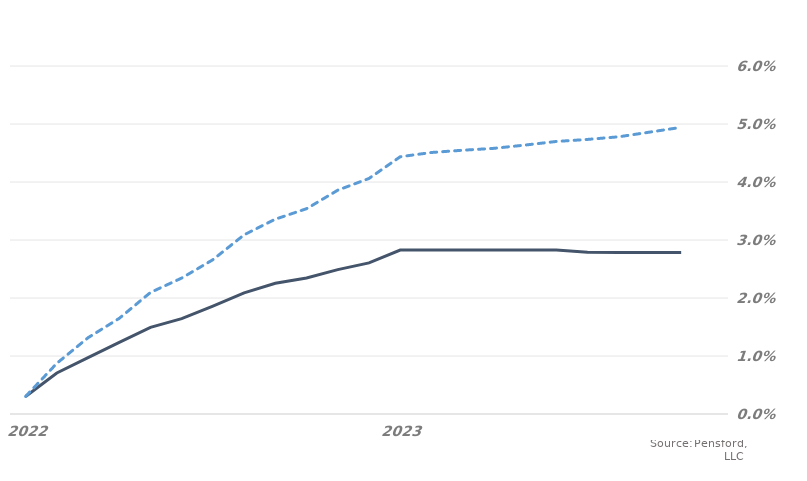
| Category | MARKET EXPECTATIONS | +1 Standard Deviation |
|---|---|---|
| 2022-03-31 | 0.003 | 0.003 |
| 2022-04-30 | 0.007 | 0.009 |
| 2022-05-30 | 0.01 | 0.013 |
| 2022-06-30 | 0.012 | 0.016 |
| 2022-07-30 | 0.015 | 0.021 |
| 2022-08-30 | 0.016 | 0.023 |
| 2022-09-30 | 0.019 | 0.027 |
| 2022-10-30 | 0.021 | 0.031 |
| 2022-11-30 | 0.023 | 0.034 |
| 2022-12-30 | 0.023 | 0.035 |
| 2023-01-30 | 0.025 | 0.039 |
| 2023-02-28 | 0.026 | 0.041 |
| 2023-03-28 | 0.028 | 0.044 |
| 2023-04-28 | 0.028 | 0.045 |
| 2023-05-28 | 0.028 | 0.045 |
| 2023-06-28 | 0.028 | 0.046 |
| 2023-07-28 | 0.028 | 0.046 |
| 2023-08-28 | 0.028 | 0.047 |
| 2023-09-28 | 0.028 | 0.047 |
| 2023-10-28 | 0.028 | 0.048 |
| 2023-11-28 | 0.028 | 0.049 |
| 2023-12-28 | 0.028 | 0.049 |
| 2024-01-28 | 0.028 | 0.05 |
| 2024-02-28 | 0.028 | 0.05 |
| 2024-03-28 | 0.025 | 0.047 |
| 2024-04-28 | 0.025 | 0.047 |
| 2024-05-28 | 0.025 | 0.047 |
| 2024-06-28 | 0.025 | 0.048 |
| 2024-07-28 | 0.025 | 0.048 |
| 2024-08-28 | 0.025 | 0.049 |
| 2024-09-28 | 0.025 | 0.049 |
| 2024-10-28 | 0.025 | 0.049 |
| 2024-11-28 | 0.025 | 0.05 |
| 2024-12-28 | 0.025 | 0.05 |
| 2025-01-28 | 0.025 | 0.05 |
| 2025-02-28 | 0.025 | 0.05 |
| 2025-03-28 | 0.022 | 0.046 |
| 2025-04-28 | 0.021 | 0.045 |
| 2025-05-28 | 0.021 | 0.045 |
| 2025-06-28 | 0.021 | 0.045 |
| 2025-07-28 | 0.021 | 0.046 |
| 2025-08-28 | 0.021 | 0.046 |
| 2025-09-28 | 0.021 | 0.047 |
| 2025-10-28 | 0.021 | 0.047 |
| 2025-11-28 | 0.021 | 0.047 |
| 2025-12-28 | 0.021 | 0.048 |
| 2026-01-28 | 0.021 | 0.047 |
| 2026-02-28 | 0.021 | 0.047 |
| 2026-03-28 | 0.019 | 0.045 |
| 2026-04-28 | 0.019 | 0.044 |
| 2026-05-28 | 0.019 | 0.044 |
| 2026-06-28 | 0.019 | 0.045 |
| 2026-07-28 | 0.019 | 0.045 |
| 2026-08-28 | 0.019 | 0.045 |
| 2026-09-28 | 0.019 | 0.046 |
| 2026-10-28 | 0.019 | 0.046 |
| 2026-11-28 | 0.019 | 0.046 |
| 2026-12-28 | 0.019 | 0.046 |
| 2027-01-28 | 0.019 | 0.046 |
| 2027-02-28 | 0.019 | 0.045 |
| 2027-03-28 | 0.019 | 0.045 |
| 2027-04-28 | 0.019 | 0.046 |
| 2027-05-28 | 0.019 | 0.046 |
| 2027-06-28 | 0.019 | 0.046 |
| 2027-07-28 | 0.019 | 0.046 |
| 2027-08-28 | 0.019 | 0.047 |
| 2027-09-28 | 0.019 | 0.047 |
| 2027-10-28 | 0.019 | 0.047 |
| 2027-11-28 | 0.019 | 0.047 |
| 2027-12-28 | 0.019 | 0.048 |
| 2028-01-28 | 0.019 | 0.047 |
| 2028-02-28 | 0.019 | 0.046 |
| 2028-03-28 | 0.02 | 0.046 |
| 2028-04-28 | 0.02 | 0.047 |
| 2028-05-28 | 0.02 | 0.047 |
| 2028-06-28 | 0.02 | 0.047 |
| 2028-07-28 | 0.02 | 0.047 |
| 2028-08-28 | 0.02 | 0.047 |
| 2028-09-28 | 0.02 | 0.048 |
| 2028-10-28 | 0.02 | 0.048 |
| 2028-11-28 | 0.02 | 0.048 |
| 2028-12-28 | 0.02 | 0.048 |
| 2029-01-28 | 0.02 | 0.048 |
| 2029-02-28 | 0.02 | 0.047 |
| 2029-03-28 | 0.02 | 0.047 |
| 2029-04-28 | 0.02 | 0.047 |
| 2029-05-28 | 0.02 | 0.047 |
| 2029-06-28 | 0.02 | 0.048 |
| 2029-07-28 | 0.02 | 0.048 |
| 2029-08-28 | 0.02 | 0.048 |
| 2029-09-28 | 0.02 | 0.048 |
| 2029-10-28 | 0.02 | 0.048 |
| 2029-11-28 | 0.02 | 0.049 |
| 2029-12-28 | 0.02 | 0.049 |
| 2030-01-28 | 0.02 | 0.049 |
| 2030-02-28 | 0.02 | 0.048 |
| 2030-03-28 | 0.02 | 0.049 |
| 2030-04-28 | 0.02 | 0.049 |
| 2030-05-28 | 0.02 | 0.049 |
| 2030-06-28 | 0.02 | 0.049 |
| 2030-07-28 | 0.02 | 0.049 |
| 2030-08-28 | 0.02 | 0.049 |
| 2030-09-28 | 0.02 | 0.05 |
| 2030-10-28 | 0.02 | 0.05 |
| 2030-11-28 | 0.02 | 0.05 |
| 2030-12-28 | 0.02 | 0.05 |
| 2031-01-28 | 0.02 | 0.049 |
| 2031-02-28 | 0.02 | 0.049 |
| 2031-03-28 | 0.02 | 0.048 |
| 2031-04-28 | 0.02 | 0.049 |
| 2031-05-28 | 0.02 | 0.049 |
| 2031-06-28 | 0.02 | 0.049 |
| 2031-07-28 | 0.02 | 0.049 |
| 2031-08-28 | 0.02 | 0.049 |
| 2031-09-28 | 0.02 | 0.05 |
| 2031-10-28 | 0.02 | 0.05 |
| 2031-11-28 | 0.02 | 0.05 |
| 2031-12-28 | 0.02 | 0.05 |
| 2032-01-28 | 0.02 | 0.05 |
| 2032-02-28 | 0.02 | 0.051 |